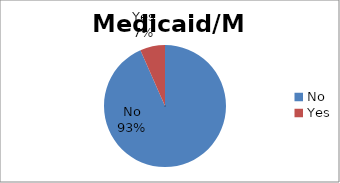
| Category | Series 0 |
|---|---|
| No | 93.402 |
| Yes | 6.598 |